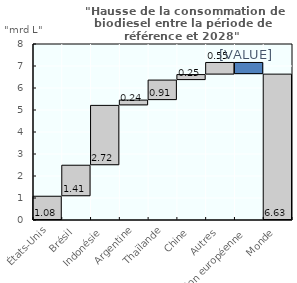
| Category | Series 1 | Series 0 |
|---|---|---|
| États-Unis | 0 | 1.08 |
| Brésil | 1.08 | 1.41 |
| Indonésie | 2.49 | 2.72 |
| Argentine | 5.21 | 0.24 |
| Thaïlande | 5.45 | 0.91 |
| Chine | 6.36 | 0.25 |
| Autres | 6.61 | 0.55 |
| Union européenne | 6.63 | 0.53 |
| Monde | 0 | 6.63 |